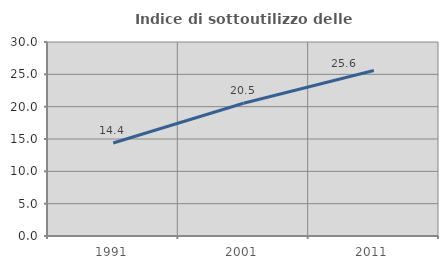
| Category | Indice di sottoutilizzo delle abitazioni  |
|---|---|
| 1991.0 | 14.375 |
| 2001.0 | 20.532 |
| 2011.0 | 25.584 |